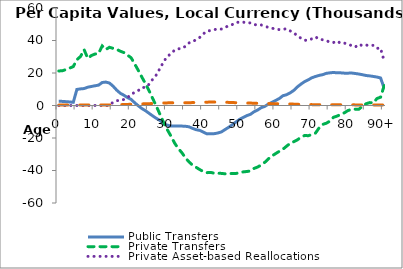
| Category | Public Transfers | Private Transfers | Private Asset-based Reallocations | Public Asset-based Reallocations |
|---|---|---|---|---|
| 0 | 2626.868 | 21260.283 | 0.073 | 228.934 |
|  | 2527.509 | 21390.39 | 0.039 | 236.012 |
| 2 | 2361.359 | 22159.422 | 0.463 | 243.089 |
| 3 | 2182.73 | 23003.542 | 7.569 | 250.167 |
| 4 | 1961.948 | 23948.852 | 13.278 | 257.806 |
| 5 | 9879.304 | 28176.835 | 14.368 | 265.815 |
| 6 | 10226.696 | 30159.291 | 11.482 | 274.432 |
| 7 | 10427.136 | 34353.576 | 11.727 | 283.635 |
| 8 | 11255.374 | 29059.595 | 11.931 | 292.551 |
| 9 | 11695.158 | 30743.593 | 15.501 | 303.468 |
| 10 | 12144.392 | 31669.697 | 17.895 | 315.815 |
| 11 | 12524.101 | 31998.22 | 18.283 | 329.104 |
| 12 | 14157.416 | 36641.057 | 22.149 | 344.221 |
| 13 | 14410.58 | 34448.556 | 25.476 | 360.602 |
| 14 | 13814.579 | 35825.202 | 28.892 | 379.323 |
| 15 | 11934.714 | 35176.109 | 1997.039 | 422.465 |
| 16 | 9489.049 | 34551.92 | 2997.441 | 479.492 |
| 17 | 7539.737 | 33440.648 | 3072.7 | 536.682 |
| 18 | 6325.611 | 32556.328 | 3694.673 | 594.861 |
| 19 | 4884.888 | 31026.178 | 4789.468 | 666.86 |
| 20 | 3768.151 | 29374.071 | 6987.988 | 745.319 |
| 21 | 1664.323 | 25538.679 | 8012.254 | 826.169 |
| 22 | -200.936 | 21548.048 | 9231.704 | 907.182 |
| 23 | -1903.691 | 17349.226 | 11080.21 | 977.025 |
| 24 | -3245.238 | 13332.403 | 11143.012 | 1045.105 |
| 25 | -4864.578 | 8937.032 | 13151.366 | 1122.856 |
| 26 | -6443.441 | 4155.818 | 16233.295 | 1220.096 |
| 27 | -7946.052 | -527.405 | 18915.369 | 1336.411 |
| 28 | -9217.828 | -5553.831 | 22884.762 | 1422.898 |
| 29 | -11219.906 | -10488.836 | 26985.891 | 1551.271 |
| 30 | -12094.486 | -14853.739 | 30173.122 | 1612.19 |
| 31 | -12601.061 | -18747.883 | 31785.939 | 1642.501 |
| 32 | -12634.411 | -23001.205 | 34031.801 | 1653.835 |
| 33 | -12583.62 | -26384.178 | 34885.827 | 1678.764 |
| 34 | -12672.541 | -28934.942 | 35054.498 | 1664.63 |
| 35 | -12767.884 | -32094.644 | 36385.056 | 1692.997 |
| 36 | -13112.076 | -34682.425 | 38503.718 | 1711.261 |
| 37 | -14086.252 | -36771.88 | 39188.119 | 1790.824 |
| 38 | -14898.011 | -38075.199 | 40582.762 | 1862.163 |
| 39 | -15329.958 | -39461.043 | 41907.858 | 1899.304 |
| 40 | -16399.867 | -40667.229 | 44106.597 | 1989.177 |
| 41 | -17466.05 | -41326.677 | 45844.204 | 2069.498 |
| 42 | -17371.145 | -41161.687 | 46150.105 | 2090.464 |
| 43 | -17330.559 | -41684.308 | 46722.687 | 2110.7 |
| 44 | -16913.34 | -41643.68 | 47031.69 | 2107.302 |
| 45 | -16229.412 | -41788.348 | 47040.68 | 2080.564 |
| 46 | -14774.484 | -42028.67 | 48152.103 | 1989.244 |
| 47 | -13393.729 | -42004.326 | 48977.501 | 1908.577 |
| 48 | -11817.753 | -41779.042 | 49810.084 | 1826.765 |
| 49 | -10142.821 | -41834.603 | 51116.896 | 1723.462 |
| 50 | -8511.05 | -41231.731 | 51270.569 | 1618.493 |
| 51 | -7389.659 | -40866.5 | 51318.849 | 1558.212 |
| 52 | -6230.041 | -40617.447 | 50744.857 | 1500.105 |
| 53 | -5434.905 | -40256.334 | 50853.74 | 1484.546 |
| 54 | -3860.279 | -38732.085 | 49739.084 | 1421.079 |
| 55 | -2770.945 | -37855.647 | 49674.742 | 1368.534 |
| 56 | -1323.284 | -36565.273 | 49561.994 | 1287.5 |
| 57 | -525.197 | -34918.044 | 48773.757 | 1252.585 |
| 58 | 906.68 | -32761.584 | 48046.954 | 1186.525 |
| 59 | 2029.525 | -30999.168 | 47522.779 | 1138.309 |
| 60 | 3116.18 | -29558.326 | 47134.749 | 1089.886 |
| 61 | 4310.959 | -28175.323 | 46691.008 | 1045.288 |
| 62 | 6022.562 | -26888.981 | 46942.184 | 982.214 |
| 63 | 6631.337 | -25035.411 | 47190.005 | 950.251 |
| 64 | 7794.915 | -23293.337 | 45921.787 | 905.465 |
| 65 | 9318.321 | -22281.65 | 44730.673 | 840.548 |
| 66 | 11463.898 | -21113.763 | 42855.903 | 726.949 |
| 67 | 13191.363 | -19517.399 | 41378.383 | 650.651 |
| 68 | 14708.885 | -18436.397 | 40109.841 | 588.779 |
| 69 | 15795.56 | -18585.71 | 40223.771 | 551.558 |
| 70 | 17086.839 | -17847.655 | 41035.639 | 537.344 |
| 71 | 17857.198 | -16967.215 | 42250.528 | 521.965 |
| 72 | 18519.808 | -13768.445 | 40773.878 | 499.744 |
| 73 | 18990.209 | -11632.763 | 40455.136 | 477.444 |
| 74 | 19789.135 | -10905.665 | 39852.03 | 458.2 |
| 75 | 20107.404 | -9560.018 | 39006.118 | 447.801 |
| 76 | 20342.075 | -7244.358 | 38770.734 | 435.282 |
| 77 | 20077.775 | -6475.638 | 39658.784 | 431.214 |
| 78 | 20090.683 | -5483.881 | 38178.07 | 423.573 |
| 79 | 19905.169 | -4478.998 | 38361.416 | 413.292 |
| 80 | 19908.104 | -3072.963 | 37829.799 | 404.158 |
| 81 | 19981.591 | -2348.532 | 36814.535 | 395.895 |
| 82 | 19702.237 | -2249.662 | 35973.463 | 379.854 |
| 83 | 19359.917 | -2259.083 | 37691.869 | 371.136 |
| 84 | 18939.37 | -488.314 | 36786.675 | 361.434 |
| 85 | 18457.725 | 1086.013 | 37238.766 | 352.309 |
| 86 | 18211.358 | 1777.9 | 36767.589 | 339.681 |
| 87 | 17886.981 | 1595.626 | 37043.078 | 330.679 |
| 88 | 17504.33 | 4293.011 | 35190.603 | 324.887 |
| 89 | 16938.711 | 5120.203 | 35279.98 | 320.399 |
| 90+ | 10652.721 | 12231.245 | 27161.079 | 306.901 |